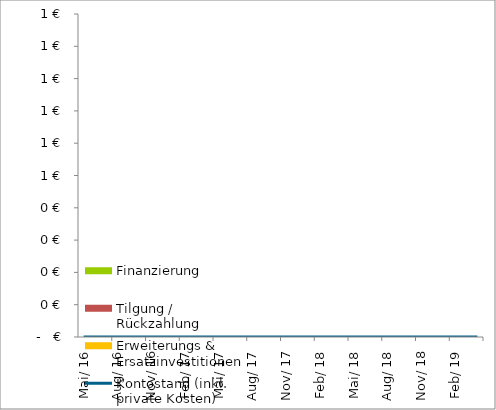
| Category | Finanzierung | Tilgung / Rückzahlung | Erweiterungs & Ersatzinvestitionen |
|---|---|---|---|
| 2016-05-01 | 0 | 0 | 0 |
| 2016-06-01 | 0 | 0 | 0 |
| 2016-07-01 | 0 | 0 | 0 |
| 2016-08-01 | 0 | 0 | 0 |
| 2016-09-01 | 0 | 0 | 0 |
| 2016-10-01 | 0 | 0 | 0 |
| 2016-11-01 | 0 | 0 | 0 |
| 2016-12-01 | 0 | 0 | 0 |
| 2017-01-01 | 0 | 0 | 0 |
| 2017-02-01 | 0 | 0 | 0 |
| 2017-03-01 | 0 | 0 | 0 |
| 2017-04-01 | 0 | 0 | 0 |
| 2017-05-01 | 0 | 0 | 0 |
| 2017-06-01 | 0 | 0 | 0 |
| 2017-07-01 | 0 | 0 | 0 |
| 2017-08-01 | 0 | 0 | 0 |
| 2017-09-01 | 0 | 0 | 0 |
| 2017-10-01 | 0 | 0 | 0 |
| 2017-11-01 | 0 | 0 | 0 |
| 2017-12-01 | 0 | 0 | 0 |
| 2018-01-01 | 0 | 0 | 0 |
| 2018-02-01 | 0 | 0 | 0 |
| 2018-03-01 | 0 | 0 | 0 |
| 2018-04-01 | 0 | 0 | 0 |
| 2018-05-01 | 0 | 0 | 0 |
| 2018-06-01 | 0 | 0 | 0 |
| 2018-07-01 | 0 | 0 | 0 |
| 2018-08-01 | 0 | 0 | 0 |
| 2018-09-01 | 0 | 0 | 0 |
| 2018-10-01 | 0 | 0 | 0 |
| 2018-11-01 | 0 | 0 | 0 |
| 2018-12-01 | 0 | 0 | 0 |
| 2019-01-01 | 0 | 0 | 0 |
| 2019-02-01 | 0 | 0 | 0 |
| 2019-03-01 | 0 | 0 | 0 |
| 2019-04-01 | 0 | 0 | 0 |